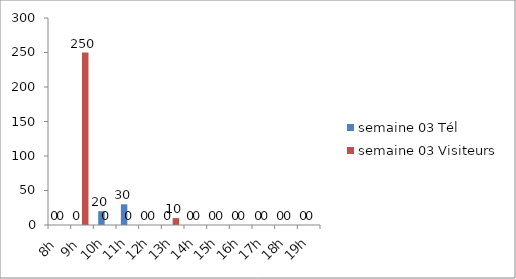
| Category | semaine 03 Tél | semaine 03 Visiteurs |
|---|---|---|
| 8h | 0 | 0 |
| 9h | 0 | 250 |
| 10h | 20 | 0 |
| 11h | 30 | 0 |
| 12h | 0 | 0 |
| 13h | 0 | 10 |
| 14h | 0 | 0 |
| 15h | 0 | 0 |
| 16h | 0 | 0 |
| 17h | 0 | 0 |
| 18h | 0 | 0 |
| 19h | 0 | 0 |